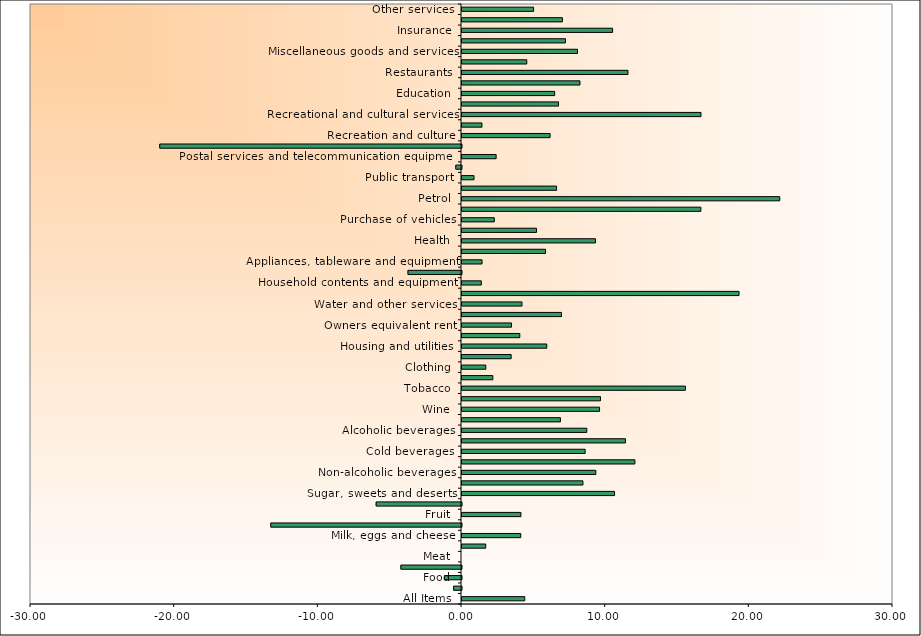
| Category | Feb Inflation Rate |
|---|---|
| All Items | 4.368 |
| Food and non alcoholic beverages | -0.547 |
| Food | -1.186 |
| Bread and cereals | -4.22 |
| Meat | 0 |
| Fish | 1.651 |
| Milk, eggs and cheese | 4.089 |
| Oils and fats | -13.273 |
| Fruit | 4.101 |
| Vegetables | -5.94 |
| Sugar, sweets and deserts | 10.618 |
| Other food | 8.418 |
| Non-alcoholic beverages | 9.315 |
| Hot beverages | 12.035 |
| Cold beverages | 8.571 |
| Alcoholic beverages and tobacco | 11.377 |
| Alcoholic beverages | 8.687 |
| Spirits | 6.851 |
| Wine | 9.574 |
| Beer | 9.64 |
| Tobacco | 15.551 |
| Clothing and footwear | 2.146 |
| Clothing | 1.657 |
| Footwear | 3.421 |
| Housing and utilities | 5.899 |
| Actual rentals for housing | 4.023 |
| Owners equivalent rent | 3.445 |
| Maintenance and repair | 6.924 |
| Water and other services | 4.175 |
| Electricity and other fuels | 19.284 |
| Household contents and equipment | 1.342 |
| Furnishings, floor coverings and textiles | -3.725 |
| Appliances, tableware and equipment | 1.395 |
| Supplies and services | 5.815 |
| Health | 9.292 |
| Transport | 5.188 |
| Purchase of vehicles | 2.248 |
| Private transport operation | 16.627 |
| Petrol | 22.115 |
| Other running costs | 6.584 |
| Public transport | 0.836 |
| Communication | -0.398 |
| Postal services and telecommunication equipment | 2.376 |
| Telecmmunication services | -21.004 |
| Recreation and culture | 6.132 |
| Recreational equipment | 1.389 |
| Recreational and cultural services | 16.635 |
| Books, newspapers and stationery | 6.719 |
| Education | 6.448 |
| Restaurants and hotels | 8.21 |
| Restaurants | 11.553 |
| Hotels | 4.508 |
| Miscellaneous goods and services | 8.04 |
| Personal care | 7.202 |
| Insurance | 10.482 |
| Financial services | 6.989 |
| Other services | 4.983 |